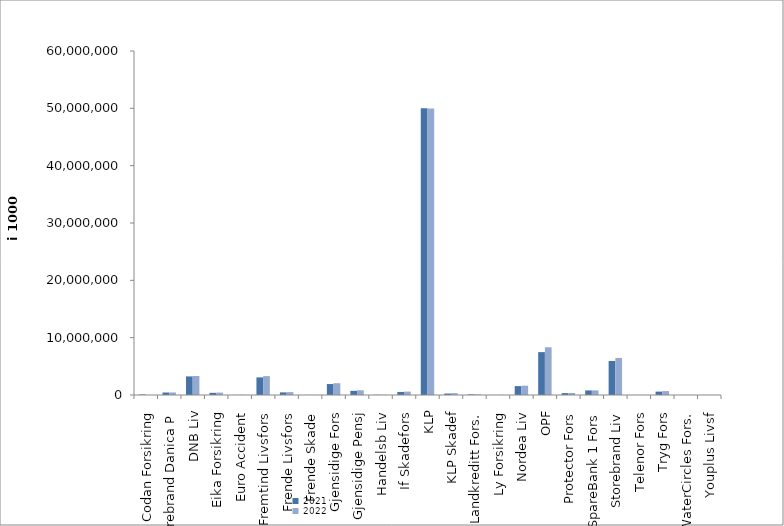
| Category | 2021 | 2022 |
|---|---|---|
| Codan Forsikring | 82704 | 0 |
| Storebrand Danica P | 434013.95 | 446524.267 |
| DNB Liv | 3243248.2 | 3309302.725 |
| Eika Forsikring | 375779 | 422091 |
| Euro Accident | 10960 | 32885 |
| Fremtind Livsfors | 3074791.831 | 3294986.774 |
| Frende Livsfors | 458515 | 505151 |
| Frende Skade | 7999.02 | 9115.469 |
| Gjensidige Fors | 1910669.164 | 2060959.478 |
| Gjensidige Pensj | 726294 | 822113 |
| Handelsb Liv | 34165.242 | 37620.57 |
| If Skadefors | 535456.72 | 594471.875 |
| KLP | 50026045.508 | 49973107.937 |
| KLP Skadef | 253776.878 | 318629.59 |
| Landkreditt Fors. | 112320 | 101798 |
| Ly Forsikring | 0 | 22009 |
| Nordea Liv | 1552615 | 1622443.76 |
| OPF | 7476722 | 8323811 |
| Protector Fors | 331132.553 | 356049.577 |
| SpareBank 1 Fors | 799976.188 | 803617.729 |
| Storebrand Liv | 5938754.061 | 6462440.276 |
| Telenor Fors | 1344 | 8426 |
| Tryg Fors | 589319.004 | 683873 |
| WaterCircles Fors. | 1909 | 2052 |
| Youplus Livsf | 0 | 2177 |